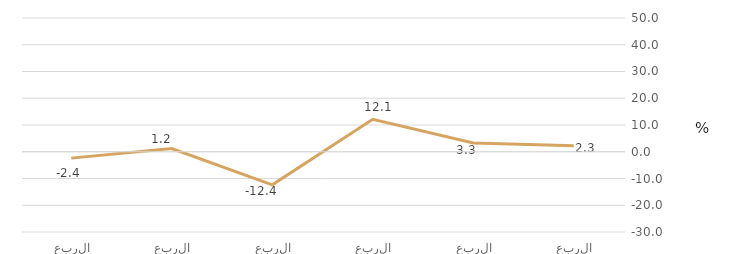
| Category | قطاع الشركات المالية |
|---|---|
| الربع الرابع 2017 | 2.272 |
| الربع الأول 2018 | 3.266 |
| الربع الثاني 2018 | 12.116 |
| الربع الثالث 2018 | -12.365 |
| الربع الرابع 2018 | 1.191 |
| الربع الأول 2019 | -2.381 |